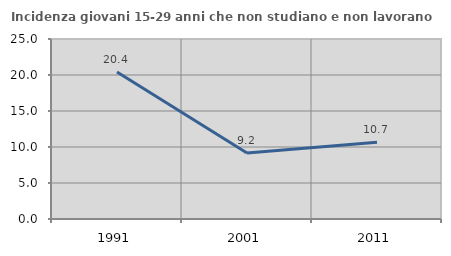
| Category | Incidenza giovani 15-29 anni che non studiano e non lavorano  |
|---|---|
| 1991.0 | 20.426 |
| 2001.0 | 9.166 |
| 2011.0 | 10.673 |